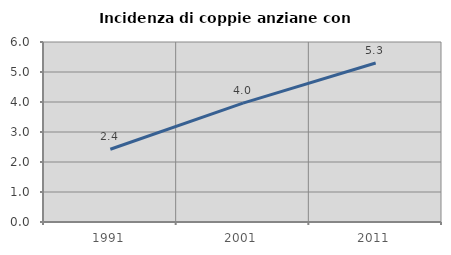
| Category | Incidenza di coppie anziane con figli |
|---|---|
| 1991.0 | 2.425 |
| 2001.0 | 3.962 |
| 2011.0 | 5.298 |